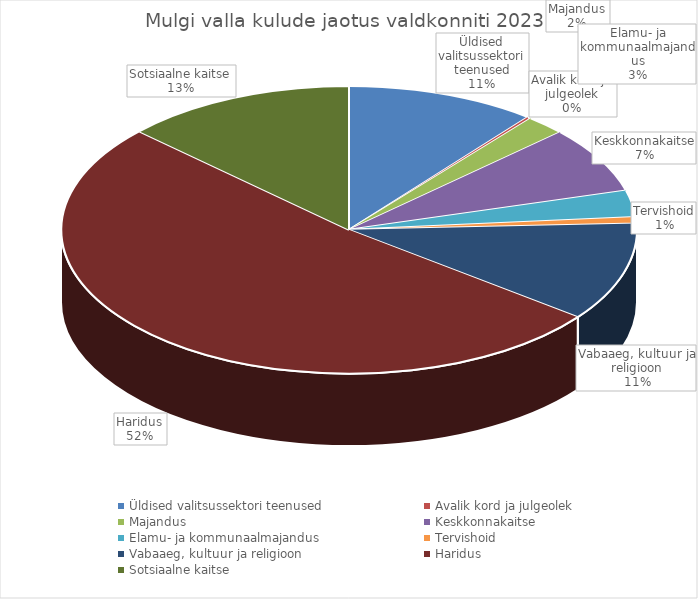
| Category | Series 0 |
|---|---|
| Üldised valitsussektori teenused | 0.107 |
| Avalik kord ja julgeolek | 0.002 |
| Majandus | 0.022 |
| Keskkonnakaitse | 0.075 |
| Elamu- ja kommunaalmajandus | 0.03 |
| Tervishoid | 0.007 |
| Vabaaeg, kultuur ja religioon | 0.111 |
| Haridus | 0.516 |
| Sotsiaalne kaitse | 0.13 |